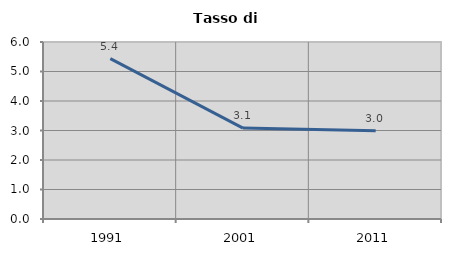
| Category | Tasso di disoccupazione   |
|---|---|
| 1991.0 | 5.437 |
| 2001.0 | 3.083 |
| 2011.0 | 2.99 |